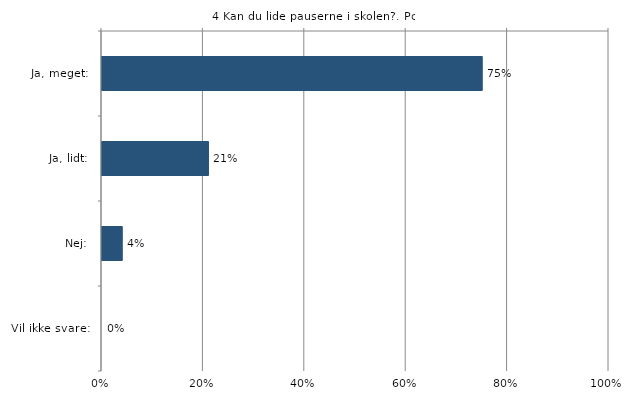
| Category | Kan du lide pauserne i skolen? |
|---|---|
| Ja, meget:  | 0.75 |
| Ja, lidt:  | 0.21 |
| Nej:  | 0.04 |
| Vil ikke svare:  | 0 |